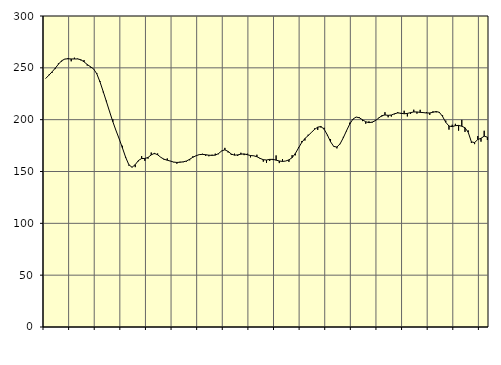
| Category | Piggar | Series 1 |
|---|---|---|
| nan | 239.7 | 239.65 |
| 87.0 | 243.3 | 242.8 |
| 87.0 | 245.1 | 246.07 |
| 87.0 | 248.8 | 249.6 |
| nan | 254.3 | 253.47 |
| 88.0 | 256.1 | 256.8 |
| 88.0 | 258.3 | 258.48 |
| 88.0 | 259.5 | 258.73 |
| nan | 256.3 | 258.58 |
| 89.0 | 259.8 | 258.54 |
| 89.0 | 258.9 | 258.57 |
| 89.0 | 257.2 | 257.83 |
| nan | 257.5 | 255.8 |
| 90.0 | 252.2 | 253.21 |
| 90.0 | 250.4 | 251.1 |
| 90.0 | 249 | 248.9 |
| nan | 244.9 | 244.19 |
| 91.0 | 237.2 | 236.37 |
| 91.0 | 226.3 | 227.07 |
| 91.0 | 218.3 | 217.39 |
| nan | 208 | 207.63 |
| 92.0 | 200.3 | 198.05 |
| 92.0 | 189.3 | 189.4 |
| 92.0 | 181.3 | 181.42 |
| nan | 174.8 | 172.77 |
| 93.0 | 163.1 | 163.76 |
| 93.0 | 155.7 | 156.57 |
| 93.0 | 154.4 | 154.07 |
| nan | 154.2 | 156.63 |
| 94.0 | 159.9 | 160.62 |
| 94.0 | 164.8 | 162.52 |
| 94.0 | 160.3 | 162.56 |
| nan | 162.4 | 163.52 |
| 95.0 | 168.3 | 166.03 |
| 95.0 | 166.8 | 167.49 |
| 95.0 | 167.4 | 166.12 |
| nan | 163.7 | 163.63 |
| 96.0 | 161.3 | 161.84 |
| 96.0 | 162.6 | 160.87 |
| 96.0 | 160.2 | 160.03 |
| nan | 158.9 | 159.11 |
| 97.0 | 157.5 | 158.73 |
| 97.0 | 159.4 | 158.95 |
| 97.0 | 159 | 159.32 |
| nan | 159.6 | 160.12 |
| 98.0 | 160.8 | 161.78 |
| 98.0 | 164.7 | 163.71 |
| 98.0 | 165.1 | 165.22 |
| nan | 166.5 | 166.29 |
| 99.0 | 167.1 | 166.52 |
| 99.0 | 165.1 | 166.19 |
| 99.0 | 164.7 | 165.73 |
| nan | 166.2 | 165.56 |
| 0.0 | 167.2 | 165.79 |
| 0.0 | 166.7 | 167.25 |
| 0.0 | 169.6 | 169.86 |
| nan | 172.8 | 170.91 |
| 1.0 | 168.4 | 169.36 |
| 1.0 | 166 | 166.88 |
| 1.0 | 167.2 | 165.74 |
| nan | 165 | 166.01 |
| 2.0 | 168.1 | 166.73 |
| 2.0 | 165.8 | 166.95 |
| 2.0 | 167.2 | 166.2 |
| nan | 163.6 | 165.4 |
| 3.0 | 165 | 165.14 |
| 3.0 | 166.2 | 164.27 |
| 3.0 | 162.2 | 162.65 |
| nan | 159.5 | 161.38 |
| 4.0 | 158.3 | 161.1 |
| 4.0 | 160.2 | 161.69 |
| 4.0 | 161 | 161.72 |
| nan | 165.5 | 160.95 |
| 5.0 | 158.1 | 160.13 |
| 5.0 | 162 | 159.7 |
| 5.0 | 160.1 | 160.11 |
| nan | 159.3 | 161.24 |
| 6.0 | 165.8 | 163.33 |
| 6.0 | 165.6 | 167.36 |
| 6.0 | 173.3 | 172.71 |
| nan | 179.3 | 177.95 |
| 7.0 | 179.9 | 181.82 |
| 7.0 | 185.5 | 184.58 |
| 7.0 | 187.5 | 187.61 |
| nan | 191.5 | 190.58 |
| 8.0 | 190.1 | 192.79 |
| 8.0 | 192.4 | 193.4 |
| 8.0 | 192.2 | 190.78 |
| nan | 184.9 | 185.36 |
| 9.0 | 181.3 | 178.74 |
| 9.0 | 173.9 | 174.18 |
| 9.0 | 172.3 | 173.58 |
| nan | 176.4 | 176.76 |
| 10.0 | 183.4 | 182.59 |
| 10.0 | 188.8 | 189.38 |
| 10.0 | 197.1 | 195.77 |
| nan | 200.1 | 200.58 |
| 11.0 | 202.6 | 202.54 |
| 11.0 | 202.4 | 201.81 |
| 11.0 | 198.6 | 199.88 |
| nan | 196.1 | 197.98 |
| 12.0 | 198.4 | 197.13 |
| 12.0 | 197.1 | 197.63 |
| 12.0 | 199.8 | 199.04 |
| nan | 201.8 | 201.42 |
| 13.0 | 203 | 203.8 |
| 13.0 | 207.2 | 204.55 |
| 13.0 | 202.3 | 204.16 |
| nan | 203 | 204.48 |
| 14.0 | 205.2 | 205.68 |
| 14.0 | 207.3 | 206.51 |
| 14.0 | 205.6 | 206.19 |
| nan | 208.6 | 205.69 |
| 15.0 | 203.1 | 206.03 |
| 15.0 | 205.5 | 206.78 |
| 15.0 | 209.6 | 207.45 |
| nan | 205.8 | 207.44 |
| 16.0 | 209.5 | 207.04 |
| 16.0 | 207.2 | 206.81 |
| 16.0 | 207.2 | 206.42 |
| nan | 204.6 | 206.45 |
| 17.0 | 208.1 | 207.15 |
| 17.0 | 207 | 207.85 |
| 17.0 | 206.4 | 207.08 |
| nan | 204.2 | 203.06 |
| 18.0 | 199.1 | 197.45 |
| 18.0 | 190.4 | 193.85 |
| 18.0 | 195.1 | 193.29 |
| nan | 196 | 194.22 |
| 19.0 | 189.4 | 194.47 |
| 19.0 | 199.8 | 193.67 |
| 19.0 | 188.2 | 192.22 |
| nan | 189.6 | 187.86 |
| 20.0 | 177.6 | 178.59 |
| 20.0 | 176.4 | 177.9 |
| 20.0 | 184.2 | 180.85 |
| nan | 178.8 | 182.03 |
| 21.0 | 189.3 | 184.07 |
| 21.0 | 180.4 | 183.14 |